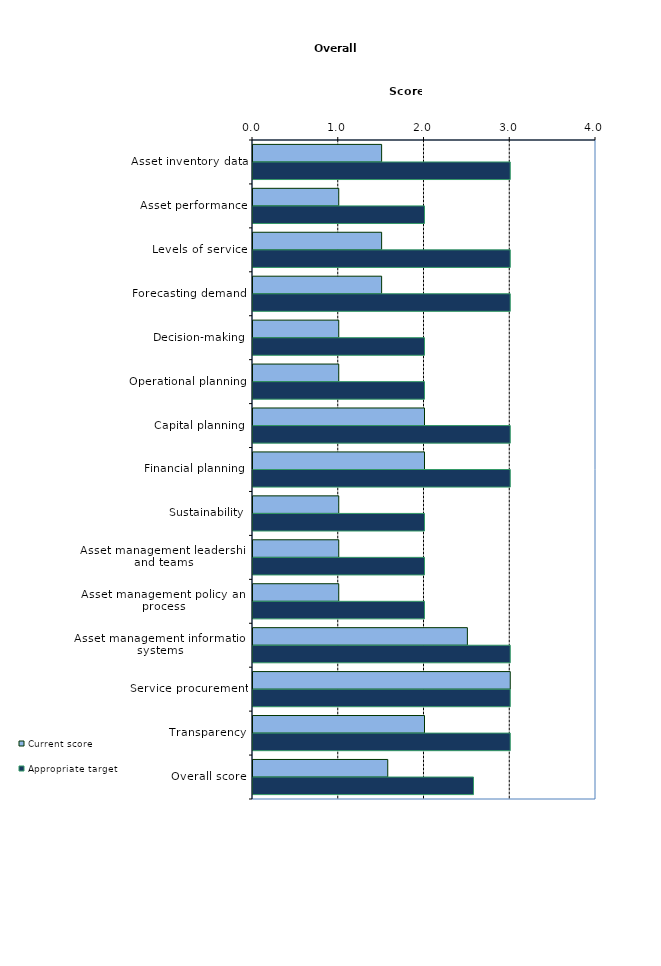
| Category | Current score | Appropriate target |
|---|---|---|
| Asset inventory data | 1.5 | 3 |
| Asset performance | 1 | 2 |
| Levels of service | 1.5 | 3 |
| Forecasting demand | 1.5 | 3 |
| Decision-making | 1 | 2 |
| Operational planning | 1 | 2 |
| Capital planning | 2 | 3 |
| Financial planning | 2 | 3 |
| Sustainability | 1 | 2 |
| Asset management leadership and teams | 1 | 2 |
| Asset management policy and process | 1 | 2 |
| Asset management information systems | 2.5 | 3 |
| Service procurement | 3 | 3 |
| Transparency | 2 | 3 |
| Overall score | 1.571 | 2.571 |